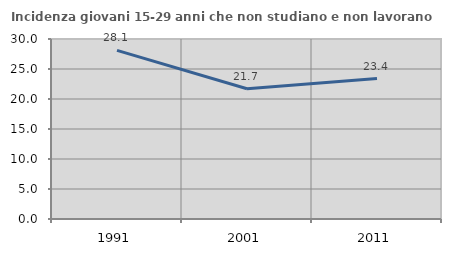
| Category | Incidenza giovani 15-29 anni che non studiano e non lavorano  |
|---|---|
| 1991.0 | 28.112 |
| 2001.0 | 21.717 |
| 2011.0 | 23.411 |